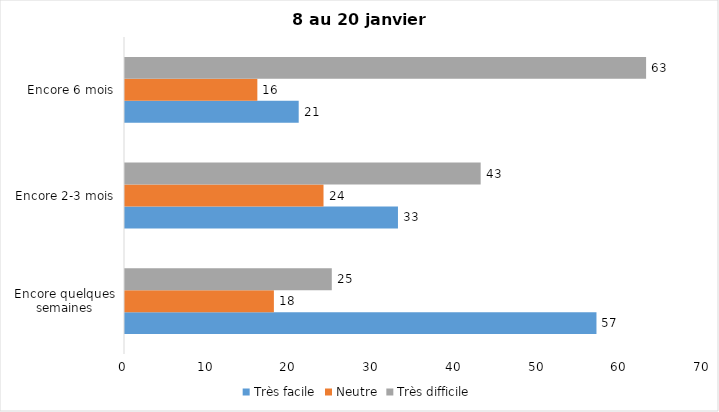
| Category | Très facile | Neutre | Très difficile |
|---|---|---|---|
| Encore quelques semaines | 57 | 18 | 25 |
| Encore 2-3 mois | 33 | 24 | 43 |
| Encore 6 mois | 21 | 16 | 63 |